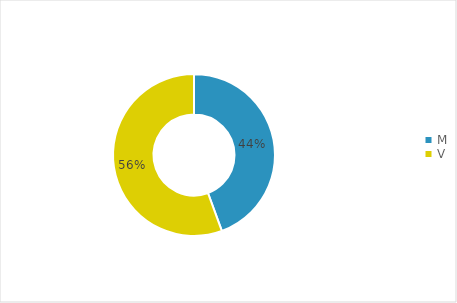
| Category | Series 1 |
|---|---|
| M | 0.444 |
| V | 0.556 |